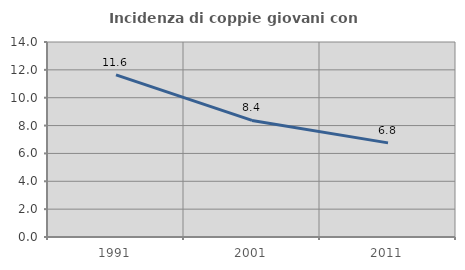
| Category | Incidenza di coppie giovani con figli |
|---|---|
| 1991.0 | 11.639 |
| 2001.0 | 8.368 |
| 2011.0 | 6.758 |